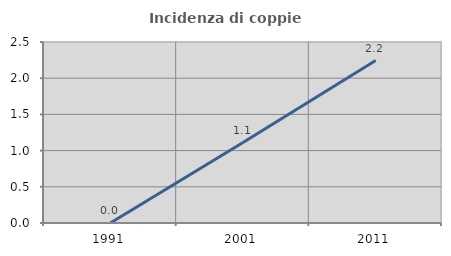
| Category | Incidenza di coppie miste |
|---|---|
| 1991.0 | 0 |
| 2001.0 | 1.111 |
| 2011.0 | 2.244 |